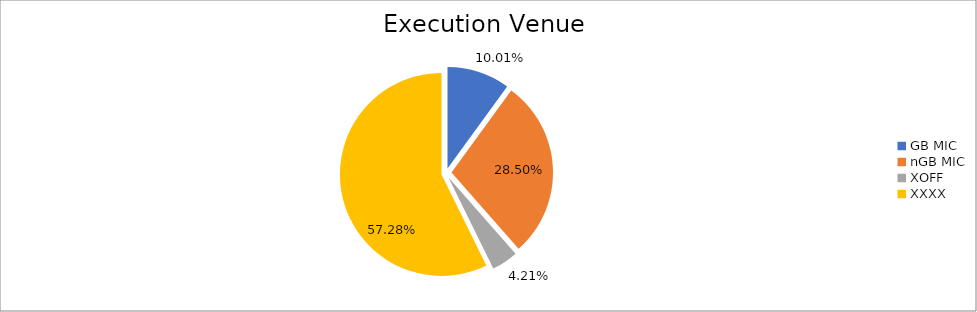
| Category | Series 0 |
|---|---|
| GB MIC | 972701.719 |
| nGB MIC | 2770678.558 |
| XOFF | 409148.506 |
| XXXX | 5567541.518 |